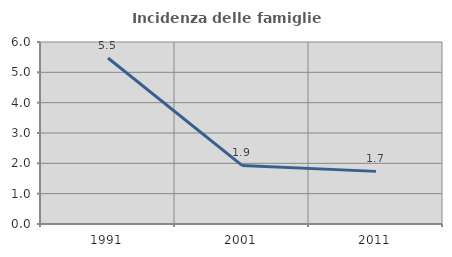
| Category | Incidenza delle famiglie numerose |
|---|---|
| 1991.0 | 5.472 |
| 2001.0 | 1.931 |
| 2011.0 | 1.735 |